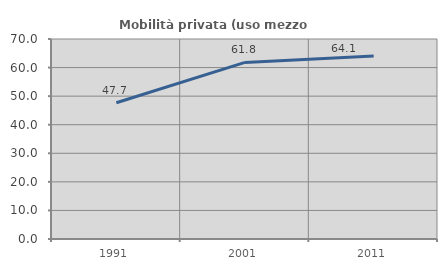
| Category | Mobilità privata (uso mezzo privato) |
|---|---|
| 1991.0 | 47.682 |
| 2001.0 | 61.816 |
| 2011.0 | 64.052 |